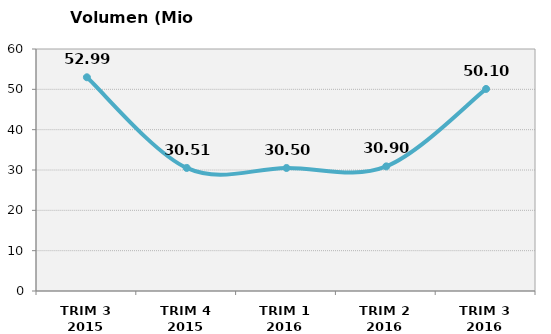
| Category | Volumen (Mio consumiciones) |
|---|---|
| TRIM 3 2015 | 52.986 |
| TRIM 4 2015 | 30.511 |
| TRIM 1 2016 | 30.5 |
| TRIM 2 2016 | 30.9 |
| TRIM 3 2016 | 50.1 |